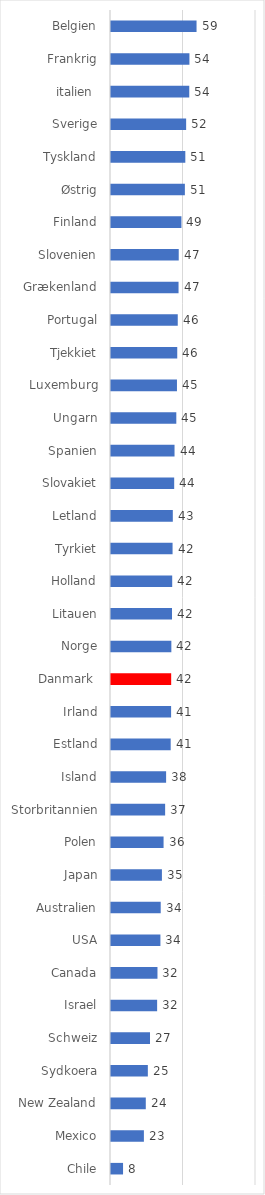
| Category | Series 0 |
|---|---|
| Chile | 8.308 |
| Mexico | 22.686 |
| New Zealand | 23.992 |
| Sydkoera | 25.414 |
| Schweiz | 26.9 |
| Israel | 31.813 |
| Canada | 32.051 |
| USA | 34.078 |
| Australien | 34.288 |
| Japan | 35.116 |
| Polen | 36.257 |
| Storbritannien | 37.334 |
| Island | 38.008 |
| Estland | 41.166 |
| Irland | 41.454 |
| Danmark  | 41.508 |
| Norge | 41.619 |
| Litauen | 42.073 |
| Holland | 42.214 |
| Tyrkiet | 42.465 |
| Letland | 42.632 |
| Slovakiet | 43.582 |
| Spanien | 43.818 |
| Ungarn | 45.041 |
| Luxemburg | 45.495 |
| Tjekkiet | 45.686 |
| Portugal | 46.039 |
| Grækenland | 46.581 |
| Slovenien | 46.714 |
| Finland | 48.576 |
| Østrig | 50.948 |
| Tyskland | 51.255 |
| Sverige | 51.821 |
| italien  | 53.974 |
| Frankrig | 54.087 |
| Belgien | 58.998 |